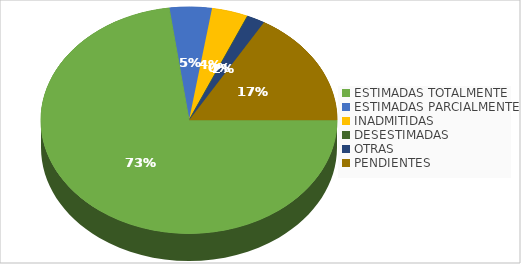
| Category | Series 0 |
|---|---|
| ESTIMADAS TOTALMENTE | 110 |
| ESTIMADAS PARCIALMENTE | 7 |
| INADMITIDAS | 6 |
| DESESTIMADAS | 0 |
| OTRAS | 3 |
| PENDIENTES | 25 |